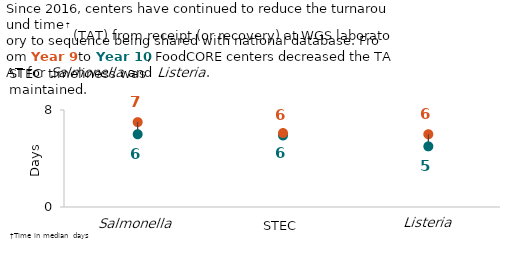
| Category | Year 9 | Year 10 |
|---|---|---|
| Salmonella | 7 | 6 |
| STEC | 5.9 | 6.1 |
| Listeria | 6 | 5 |